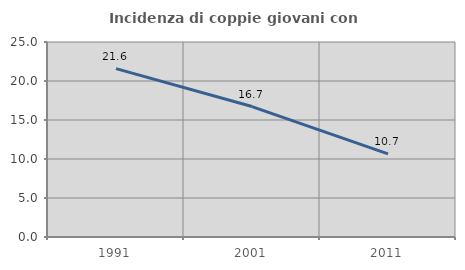
| Category | Incidenza di coppie giovani con figli |
|---|---|
| 1991.0 | 21.59 |
| 2001.0 | 16.725 |
| 2011.0 | 10.663 |